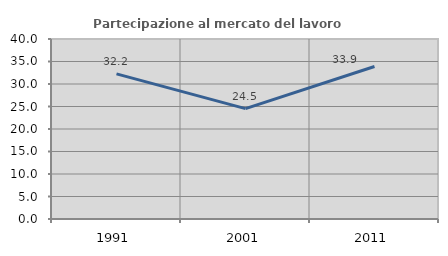
| Category | Partecipazione al mercato del lavoro  femminile |
|---|---|
| 1991.0 | 32.242 |
| 2001.0 | 24.531 |
| 2011.0 | 33.9 |